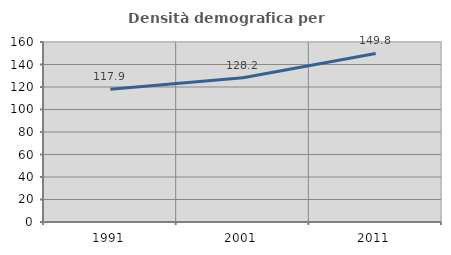
| Category | Densità demografica |
|---|---|
| 1991.0 | 117.908 |
| 2001.0 | 128.159 |
| 2011.0 | 149.833 |